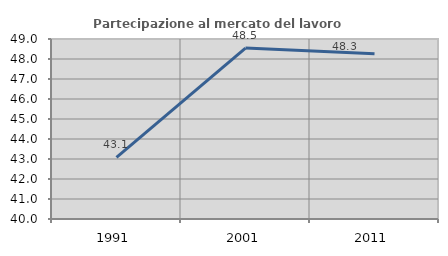
| Category | Partecipazione al mercato del lavoro  femminile |
|---|---|
| 1991.0 | 43.08 |
| 2001.0 | 48.545 |
| 2011.0 | 48.259 |